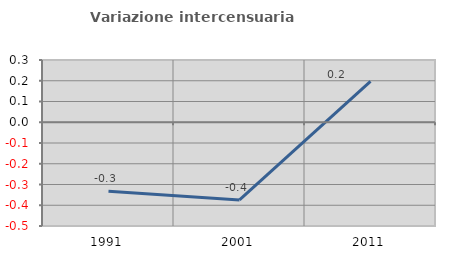
| Category | Variazione intercensuaria annua |
|---|---|
| 1991.0 | -0.333 |
| 2001.0 | -0.374 |
| 2011.0 | 0.197 |